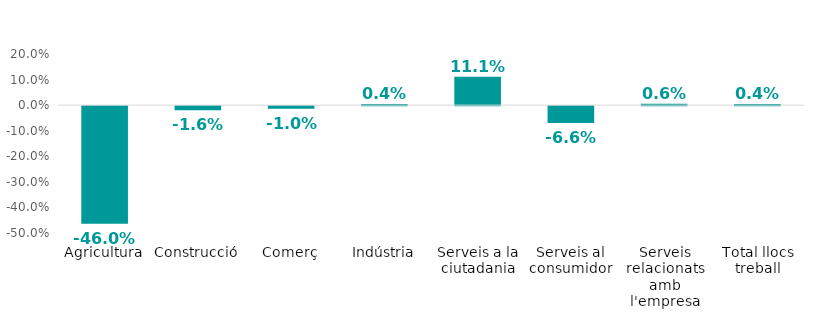
| Category | Series 0 |
|---|---|
| Agricultura | -0.46 |
| Construcció | -0.016 |
| Comerç | -0.01 |
| Indústria | 0.004 |
| Serveis a la ciutadania | 0.111 |
| Serveis al consumidor | -0.066 |
| Serveis relacionats amb l'empresa | 0.006 |
| Total llocs treball | 0.004 |